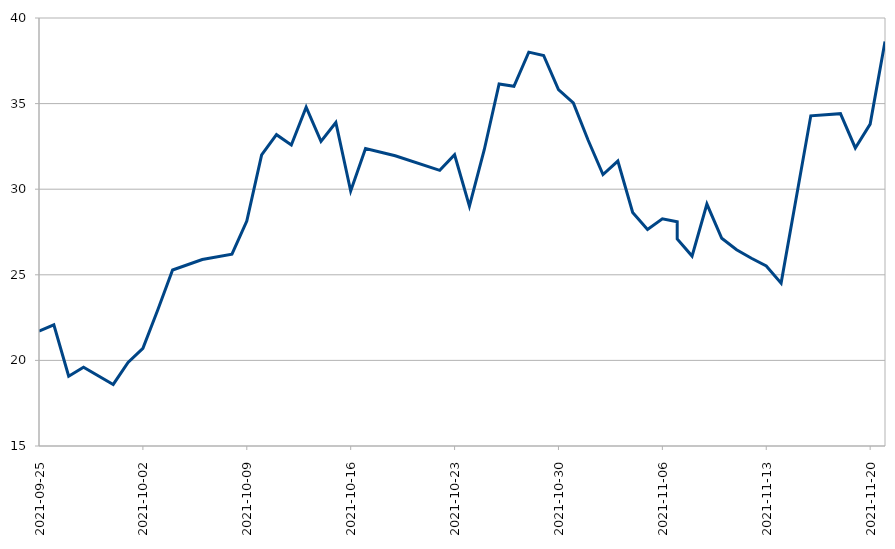
| Category | Bank |
|---|---|
| 2021-09-25 | 21.715 |
| 2021-09-26 | 22.077 |
| 2021-09-27 | 19.077 |
| 2021-09-28 | 19.596 |
| 2021-09-30 | 18.596 |
| 2021-10-01 | 19.88 |
| 2021-10-02 | 20.702 |
| 2021-10-03 | 22.945 |
| 2021-10-04 | 25.277 |
| 2021-10-06 | 25.894 |
| 2021-10-08 | 26.208 |
| 2021-10-09 | 28.137 |
| 2021-10-10 | 31.999 |
| 2021-10-11 | 33.184 |
| 2021-10-12 | 32.586 |
| 2021-10-13 | 34.79 |
| 2021-10-14 | 32.79 |
| 2021-10-15 | 33.898 |
| 2021-10-16 | 29.898 |
| 2021-10-17 | 32.377 |
| 2021-10-19 | 31.955 |
| 2021-10-22 | 31.102 |
| 2021-10-23 | 32.012 |
| 2021-10-24 | 29.012 |
| 2021-10-25 | 32.305 |
| 2021-10-26 | 36.146 |
| 2021-10-27 | 36.008 |
| 2021-10-28 | 38.007 |
| 2021-10-29 | 37.811 |
| 2021-10-30 | 35.811 |
| 2021-10-31 | 35.036 |
| 2021-11-01 | 32.859 |
| 2021-11-02 | 30.859 |
| 2021-11-03 | 31.643 |
| 2021-11-04 | 28.643 |
| 2021-11-05 | 27.643 |
| 2021-11-06 | 28.27 |
| 2021-11-07 | 28.094 |
| 2021-11-07 | 27.094 |
| 2021-11-08 | 26.094 |
| 2021-11-09 | 29.132 |
| 2021-11-10 | 27.132 |
| 2021-11-11 | 26.465 |
| 2021-11-12 | 25.965 |
| 2021-11-13 | 25.513 |
| 2021-11-14 | 24.513 |
| 2021-11-16 | 34.284 |
| 2021-11-18 | 34.411 |
| 2021-11-19 | 32.411 |
| 2021-11-20 | 33.802 |
| 2021-11-21 | 38.624 |